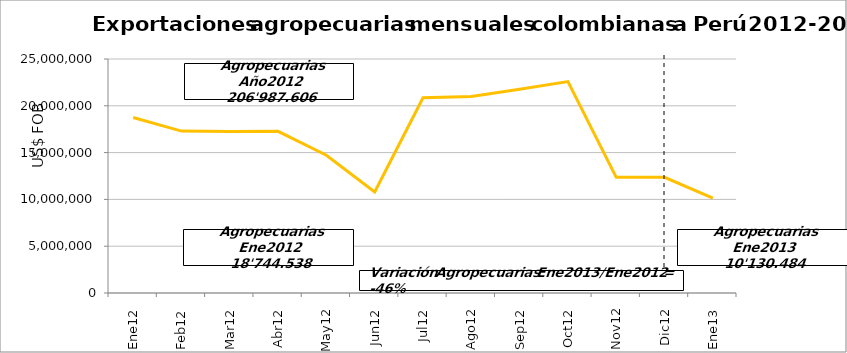
| Category | Series 0 |
|---|---|
| 0 | 18744538 |
| 1 | 17300094 |
| 2 | 17266456 |
| 3 | 17267698 |
| 4 | 14719654 |
| 5 | 10787163 |
| 6 | 20851294 |
| 7 | 20983350 |
| 8 | 21765693 |
| 9 | 22581748 |
| 10 | 12356256 |
| 11 | 12363662 |
| 12 | 10130484.37 |